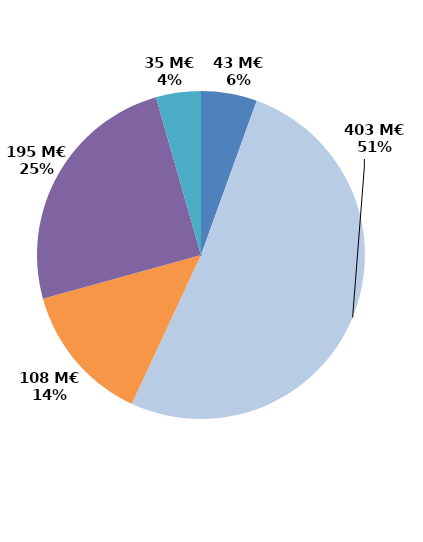
| Category | Series 0 |
|---|---|
| Contrats aidés marchand (hors IAE) | 43.259 |
| Contrats aidés non marchand (hors IAE) | 402.826 |
| Insertion par l'activité économique | 107.935 |
| Mesures en faveur des handicapés | 194.778 |
| Autres emplois aidés | 34.698 |